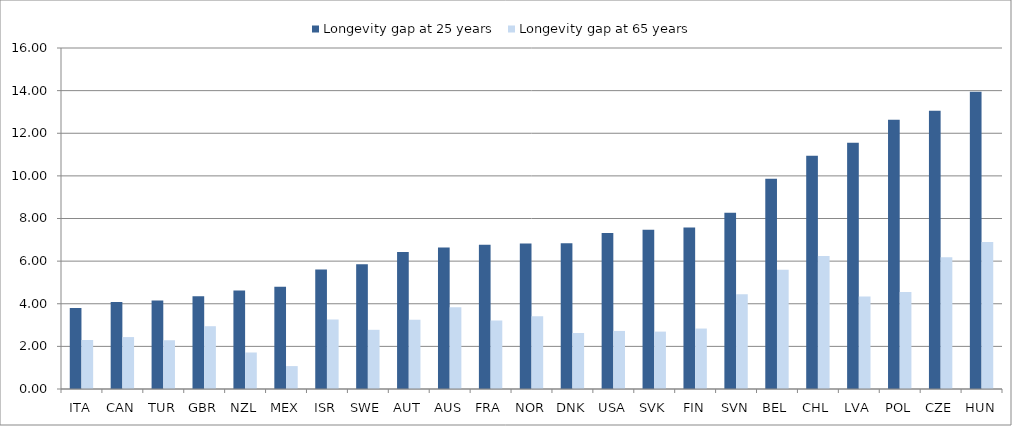
| Category | Longevity gap at 25 years | Longevity gap at 65 years |
|---|---|---|
| ITA | 3.8 | 2.298 |
| CAN | 4.085 | 2.436 |
| TUR | 4.148 | 2.287 |
| GBR | 4.355 | 2.946 |
| NZL | 4.624 | 1.713 |
| MEX | 4.801 | 1.075 |
| ISR | 5.61 | 3.266 |
| SWE | 5.856 | 2.777 |
| AUT | 6.428 | 3.25 |
| AUS | 6.642 | 3.84 |
| FRA | 6.764 | 3.209 |
| NOR | 6.826 | 3.408 |
| DNK | 6.844 | 2.628 |
| USA | 7.323 | 2.724 |
| SVK | 7.467 | 2.692 |
| FIN | 7.578 | 2.837 |
| SVN | 8.272 | 4.448 |
| BEL | 9.861 | 5.59 |
| CHL | 10.939 | 6.245 |
| LVA | 11.551 | 4.336 |
| POL | 12.633 | 4.546 |
| CZE | 13.05 | 6.187 |
| HUN | 13.943 | 6.892 |